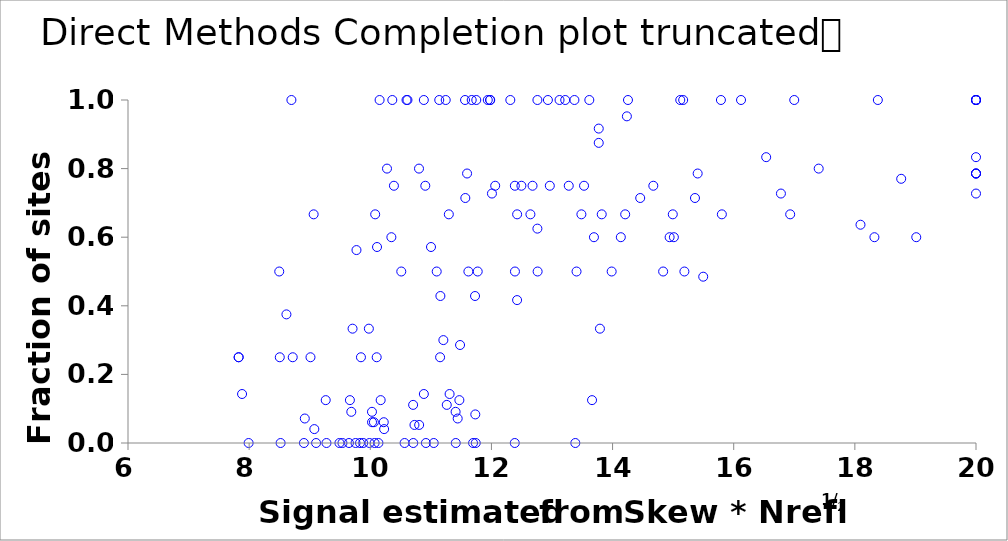
| Category | LLGC |
|---|---|
| 8.904423616349154 | 0 |
| 8.697779380210141 | 1 |
| 9.490647882077923 | 0 |
| 11.69665930433824 | 0 |
| 10.61395477967016 | 1 |
| 11.67437006889784 | 1 |
| 12.75921391640042 | 1 |
| 8.519405599906985 | 0 |
| 14.99408381330375 | 0.667 |
| 13.79139357298274 | 0.333 |
| 15.80422534693586 | 0.667 |
| 10.5662667504456 | 0 |
| 9.707329122124598 | 0.333 |
| 9.276760472811382 | 0 |
| 10.15364060634909 | 1 |
| 9.065034967838178 | 0.667 |
| 12.42437950123569 | 0.667 |
| 10.59803504403967 | 1 |
| 14.20822433235694 | 0.667 |
| 15.78884685155215 | 1 |
| 10.08083246321323 | 0.667 |
| 12.64375299802683 | 0.667 |
| 13.82094859272609 | 0.667 |
| 9.01276312959254 | 0.25 |
| 10.13446585180813 | 0 |
| 8.505853469729152 | 0.25 |
| 11.15258093204675 | 0.25 |
| 13.3848942580256 | 0 |
| 13.98501219083193 | 0.5 |
| 15.18565855112216 | 0.5 |
| 13.4051020735917 | 0.5 |
| 8.496951660820404 | 0.5 |
| 11.61949482452974 | 0.5 |
| 7.991362741169836 | 0 |
| 10.39043603432543 | 0.75 |
| 13.21805657730685 | 1 |
| 10.88406218606673 | 1 |
| 10.90831949223794 | 0.75 |
| 10.10576290935441 | 0.25 |
| 12.31190734769541 | 1 |
| 10.51160764154887 | 0.5 |
| 15.117508678916 | 1 |
| 12.3867081237443 | 0.75 |
| 13.61614012944304 | 1 |
| 11.56444198989172 | 1 |
| 11.13865208767545 | 1 |
| 13.12428348411071 | 1 |
| 11.24529489072077 | 1 |
| 12.06207263584719 | 0.75 |
| 9.105141277861739 | 0 |
| 14.94178827098643 | 0.6 |
| 15.01218793287842 | 0.6 |
| 11.04763088644734 | 0 |
| 13.69254316214084 | 0.6 |
| 10.34816997622093 | 0.6 |
| 10.27594534583927 | 0.8 |
| 10.36356455425851 | 1 |
| 10.80424595395253 | 0.8 |
| 10.07148182700858 | 0 |
| 11.7414384666823 | 0 |
| 18.3229925056957 | 0.6 |
| 13.37029120660925 | 1 |
| 20.0 | 1 |
| 18.37953512487878 | 1 |
| 11.98042953754751 | 1 |
| 12.93250887685302 | 1 |
| 11.75005773778657 | 1 |
| 15.1656378020641 | 1 |
| 14.25431250377948 | 1 |
| 16.12065665419265 | 1 |
| 20.0 | 1 |
| 20.0 | 1 |
| 20.0 | 1 |
| 20.0 | 1 |
| 20.0 | 1 |
| 11.30941761137824 | 0.143 |
| 10.11125425174311 | 0.571 |
| 10.88440971373654 | 0.143 |
| 11.0023760359028 | 0.571 |
| 11.48205771043878 | 0.286 |
| 11.7294332340968 | 0.429 |
| 9.264325964957472 | 0.125 |
| 10.17146151040151 | 0.125 |
| 7.82663791389178 | 0.25 |
| 9.84590194615479 | 0.25 |
| 7.82663791389178 | 0.25 |
| 8.719594013921085 | 0.25 |
| 16.99925644037305 | 1 |
| 12.38544287893745 | 0 |
| 10.91794895541963 | 0 |
| 12.76281264826931 | 0.5 |
| 9.66353755373613 | 0.125 |
| 8.615462146521535 | 0.375 |
| 10.70942612555771 | 0 |
| 9.648180022666667 | 0 |
| 11.97675695996634 | 1 |
| 9.756517079438307 | 0 |
| 12.38843447677363 | 0.5 |
| 11.41135324289504 | 0 |
| 11.4707798607688 | 0.125 |
| 9.986333684675731 | 0 |
| 13.77161248434936 | 0.875 |
| 11.93981694361301 | 1 |
| 9.8835487959365 | 0 |
| 14.67264207937377 | 0.75 |
| 9.83022552525119 | 0 |
| 13.48533281163613 | 0.667 |
| 11.29667671994353 | 0.667 |
| 16.93229603251613 | 0.667 |
| 11.2064337999266 | 0.3 |
| 9.540444998563824 | 0 |
| 11.7734186167464 | 0.5 |
| 14.13630382894294 | 0.6 |
| 11.09651690554001 | 0.5 |
| 19.01367070708936 | 0.6 |
| 17.40306304519538 | 0.8 |
| 14.83491115172147 | 0.5 |
| 10.02803867466331 | 0.091 |
| 11.40863957851593 | 0.091 |
| 12.00851427840937 | 0.727 |
| 18.09307497944226 | 0.636 |
| 20.0 | 0.727 |
| 13.77187742688815 | 0.917 |
| 13.27655468752768 | 0.75 |
| 12.49476554361105 | 0.75 |
| 11.73375921710938 | 0.083 |
| 12.42360379729368 | 0.417 |
| 12.9640258385667 | 0.75 |
| 12.6788838197101 | 0.75 |
| 7.883049817296589 | 0.143 |
| 11.44292679262981 | 0.071 |
| 8.918744279058181 | 0.071 |
| 11.15741080555995 | 0.429 |
| 11.59790984904862 | 0.786 |
| 15.36054339189891 | 0.714 |
| 15.40492305384931 | 0.786 |
| 11.56903976710047 | 0.714 |
| 20.0 | 0.786 |
| 20.0 | 0.786 |
| 20.0 | 0.786 |
| 12.75886077509668 | 0.625 |
| 13.66107270546395 | 0.125 |
| 9.772040746966333 | 0.562 |
| 13.52906309898512 | 0.75 |
| 16.53601177869234 | 0.833 |
| 20.0 | 0.833 |
| 14.45629138103512 | 0.714 |
| 14.23632654399194 | 0.952 |
| 9.686537533060166 | 0.091 |
| 16.77948982679185 | 0.727 |
| 10.70722373944662 | 0.111 |
| 9.976641804549624 | 0.333 |
| 11.26279669842417 | 0.111 |
| 10.22254344480292 | 0.061 |
| 10.02888090151726 | 0.061 |
| 15.49638509411768 | 0.485 |
| 10.80663247533288 | 0.053 |
| 10.72943764009707 | 0.053 |
| 10.05964283486379 | 0.061 |
| 10.22839330216725 | 0.041 |
| 9.076096373048316 | 0.041 |
| 18.76489398002018 | 0.77 |